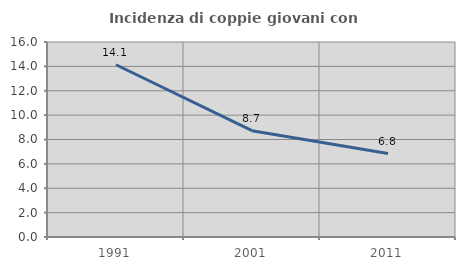
| Category | Incidenza di coppie giovani con figli |
|---|---|
| 1991.0 | 14.133 |
| 2001.0 | 8.722 |
| 2011.0 | 6.846 |